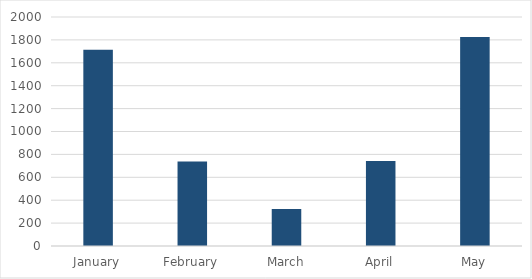
| Category | Series 0 |
|---|---|
| January | 1713 |
| February | 739 |
| March | 323 |
| April | 742 |
| May | 1826 |